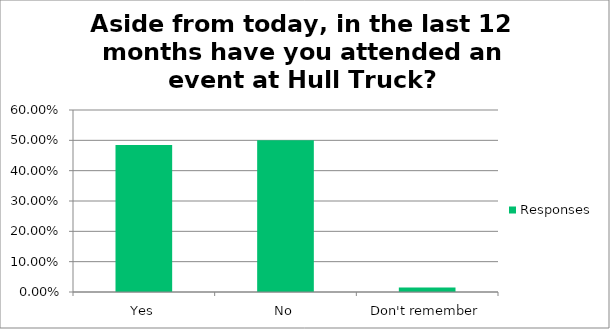
| Category | Responses |
|---|---|
| Yes | 0.485 |
| No | 0.5 |
| Don't remember | 0.015 |